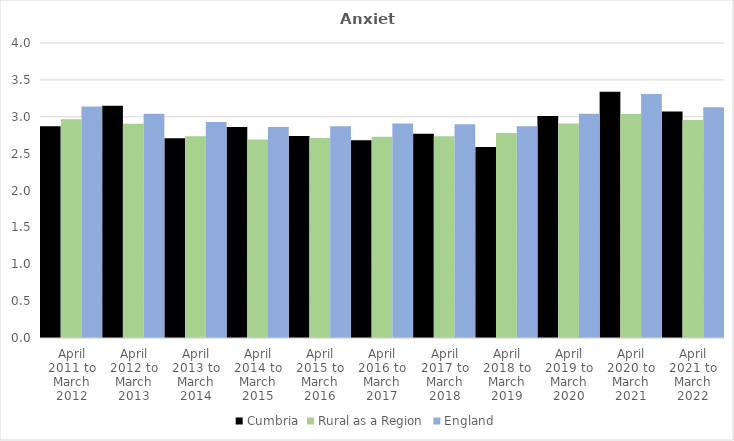
| Category | Cumbria | Rural as a Region | England |
|---|---|---|---|
| April 2011 to March 2012 | 2.87 | 2.967 | 3.14 |
| April 2012 to March 2013 | 3.15 | 2.904 | 3.04 |
| April 2013 to March 2014 | 2.71 | 2.734 | 2.93 |
| April 2014 to March 2015 | 2.86 | 2.691 | 2.86 |
| April 2015 to March 2016 | 2.74 | 2.711 | 2.87 |
| April 2016 to March 2017 | 2.68 | 2.729 | 2.91 |
| April 2017 to March 2018 | 2.77 | 2.736 | 2.9 |
| April 2018 to March 2019 | 2.59 | 2.78 | 2.87 |
| April 2019 to March 2020 | 3.01 | 2.908 | 3.04 |
| April 2020 to March 2021 | 3.34 | 3.036 | 3.31 |
| April 2021 to March 2022 | 3.07 | 2.956 | 3.13 |